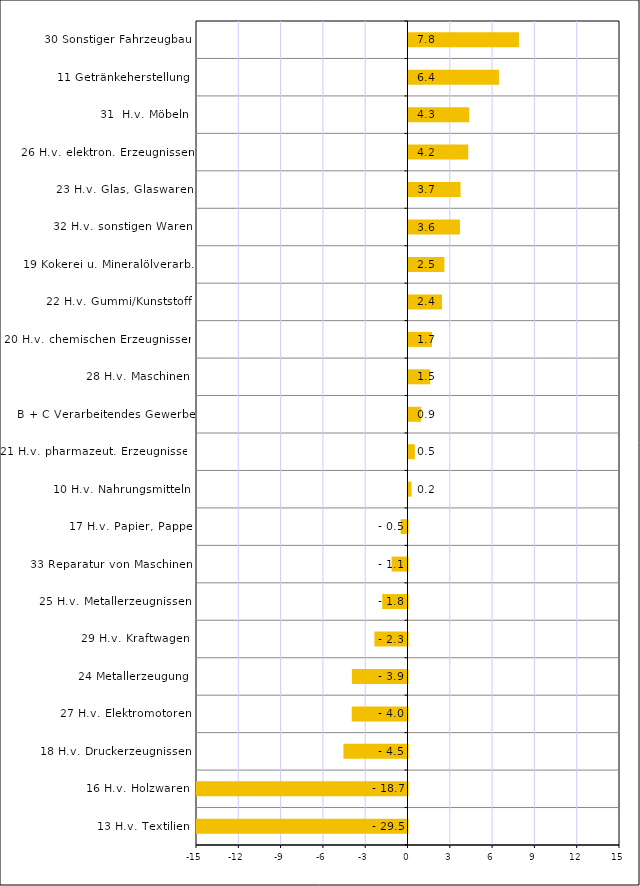
| Category | Series 0 |
|---|---|
| 13 H.v. Textilien | -29.467 |
| 16 H.v. Holzwaren | -18.728 |
| 18 H.v. Druckerzeugnissen | -4.544 |
| 27 H.v. Elektromotoren | -3.956 |
| 24 Metallerzeugung | -3.942 |
| 29 H.v. Kraftwagen | -2.347 |
| 25 H.v. Metallerzeugnissen | -1.794 |
| 33 Reparatur von Maschinen | -1.133 |
| 17 H.v. Papier, Pappe | -0.488 |
| 10 H.v. Nahrungsmitteln | 0.213 |
| 21 H.v. pharmazeut. Erzeugnissen | 0.452 |
| B + C Verarbeitendes Gewerbe | 0.883 |
| 28 H.v. Maschinen | 1.543 |
| 20 H.v. chemischen Erzeugnissen | 1.662 |
| 22 H.v. Gummi/Kunststoff | 2.373 |
| 19 Kokerei u. Mineralölverarb. | 2.545 |
| 32 H.v. sonstigen Waren | 3.649 |
| 23 H.v. Glas, Glaswaren | 3.691 |
| 26 H.v. elektron. Erzeugnissen | 4.235 |
| 31  H.v. Möbeln | 4.301 |
| 11 Getränkeherstellung | 6.414 |
| 30 Sonstiger Fahrzeugbau | 7.833 |